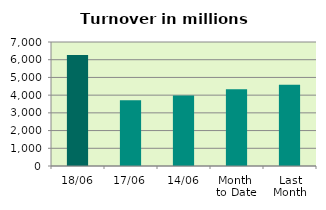
| Category | Series 0 |
|---|---|
| 18/06 | 6261.25 |
| 17/06 | 3712.158 |
| 14/06 | 3977.854 |
| Month 
to Date | 4336.37 |
| Last
Month | 4586.899 |